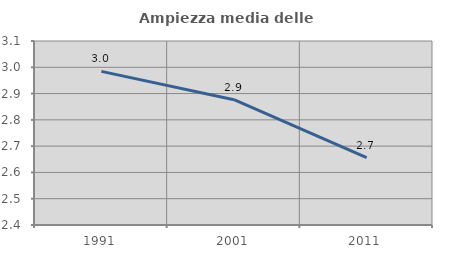
| Category | Ampiezza media delle famiglie |
|---|---|
| 1991.0 | 2.984 |
| 2001.0 | 2.877 |
| 2011.0 | 2.657 |